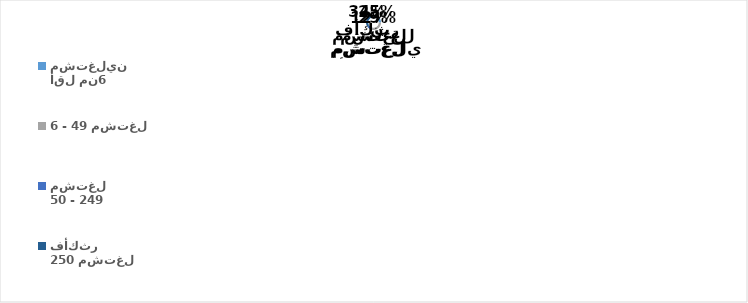
| Category | Series 0 |
|---|---|
| أقل من6 مشتغلين | 28462009 |
| 6 - 49 مشتغل | 33166494 |
| 50 - 249 مشتغل | 13942803 |
| 250 مشتغل فأكثر | 39198937 |